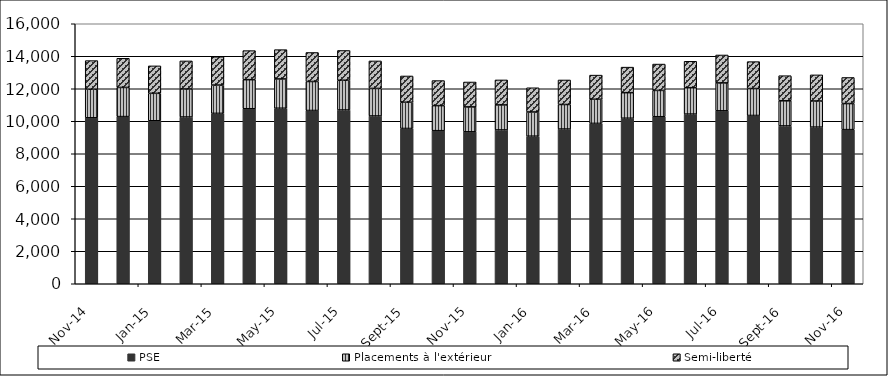
| Category | PSE | Placements à l'extérieur | Semi-liberté |
|---|---|---|---|
| 2014-11-01 | 10213 | 1760 | 1760 |
| 2014-12-01 | 10287 | 1794 | 1794 |
| 2015-01-01 | 10030 | 1689 | 1689 |
| 2015-02-01 | 10261 | 1726 | 1726 |
| 2015-03-01 | 10485 | 1742 | 1742 |
| 2015-04-01 | 10770 | 1789 | 1789 |
| 2015-05-01 | 10801 | 1803 | 1803 |
| 2015-06-01 | 10662 | 1785 | 1785 |
| 2015-07-01 | 10692 | 1832 | 1832 |
| 2015-08-01 | 10325 | 1694 | 1694 |
| 2015-09-01 | 9555 | 1616 | 1616 |
| 2015-10-01 | 9420 | 1542 | 1542 |
| 2015-11-01 | 9350 | 1533 | 1533 |
| 2015-12-01 | 9466 | 1539 | 1539 |
| 2016-01-01 | 9081 | 1490 | 1490 |
| 2016-02-01 | 9521 | 1510 | 1510 |
| 2016-03-01 | 9868 | 1486 | 1486 |
| 2016-04-01 | 10187 | 1572 | 1572 |
| 2016-05-01 | 10278 | 1621 | 1621 |
| 2016-06-01 | 10441 | 1625 | 1625 |
| 2016-07-01 | 10642 | 1718 | 1718 |
| 2016-08-01 | 10355 | 1658 | 1658 |
| 2016-09-01 | 9712 | 1546 | 1546 |
| 2016-10-01 | 9640 | 1607 | 1607 |
| 2016-11-01 | 9484 | 1605 | 1605 |